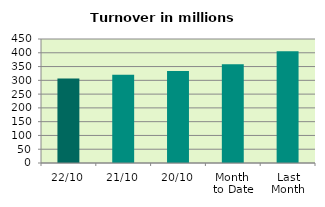
| Category | Series 0 |
|---|---|
| 22/10 | 306.401 |
| 21/10 | 320.043 |
| 20/10 | 333.429 |
| Month 
to Date | 358.212 |
| Last
Month | 405.806 |